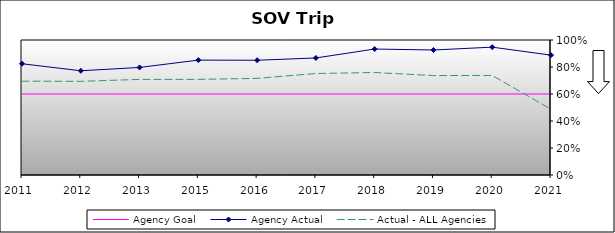
| Category | Agency Goal | Agency Actual | Actual - ALL Agencies |
|---|---|---|---|
| 2011.0 | 0.6 | 0.824 | 0.695 |
| 2012.0 | 0.6 | 0.772 | 0.694 |
| 2013.0 | 0.6 | 0.797 | 0.708 |
| 2015.0 | 0.6 | 0.851 | 0.708 |
| 2016.0 | 0.6 | 0.85 | 0.716 |
| 2017.0 | 0.6 | 0.867 | 0.752 |
| 2018.0 | 0.6 | 0.933 | 0.759 |
| 2019.0 | 0.6 | 0.926 | 0.736 |
| 2020.0 | 0.6 | 0.947 | 0.737 |
| 2021.0 | 0.6 | 0.888 | 0.487 |